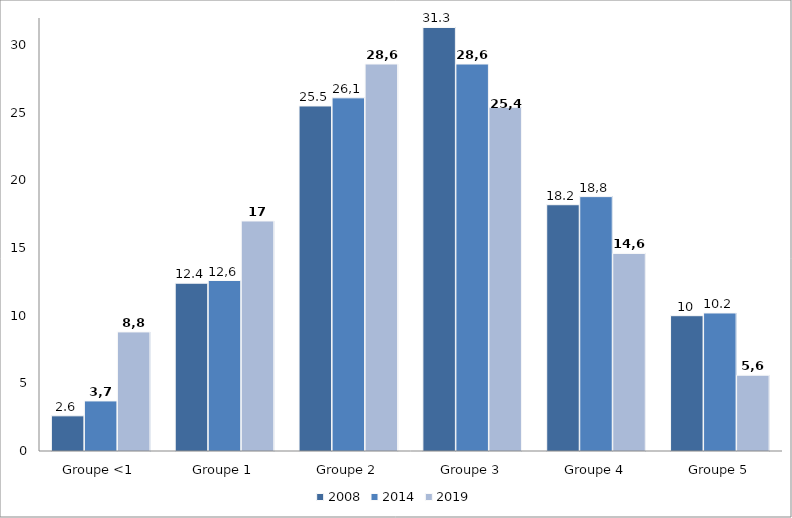
| Category | 2008 | 2014 | 2019 |
|---|---|---|---|
| Groupe <1 | 2.6 | 3.7 | 8.8 |
| Groupe 1 | 12.4 | 12.6 | 17 |
| Groupe 2 | 25.5 | 26.1 | 28.6 |
| Groupe 3 | 31.3 | 28.6 | 25.4 |
| Groupe 4 | 18.2 | 18.8 | 14.6 |
| Groupe 5 | 10 | 10.2 | 5.6 |